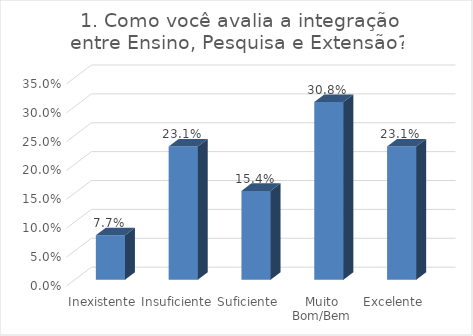
| Category | 1. Como você avalia a integração entre Ensino, Pesquisa e Extensão? |
|---|---|
| Inexistente | 0.077 |
| Insuficiente | 0.231 |
| Suficiente | 0.154 |
| Muito Bom/Bem | 0.308 |
| Excelente | 0.231 |